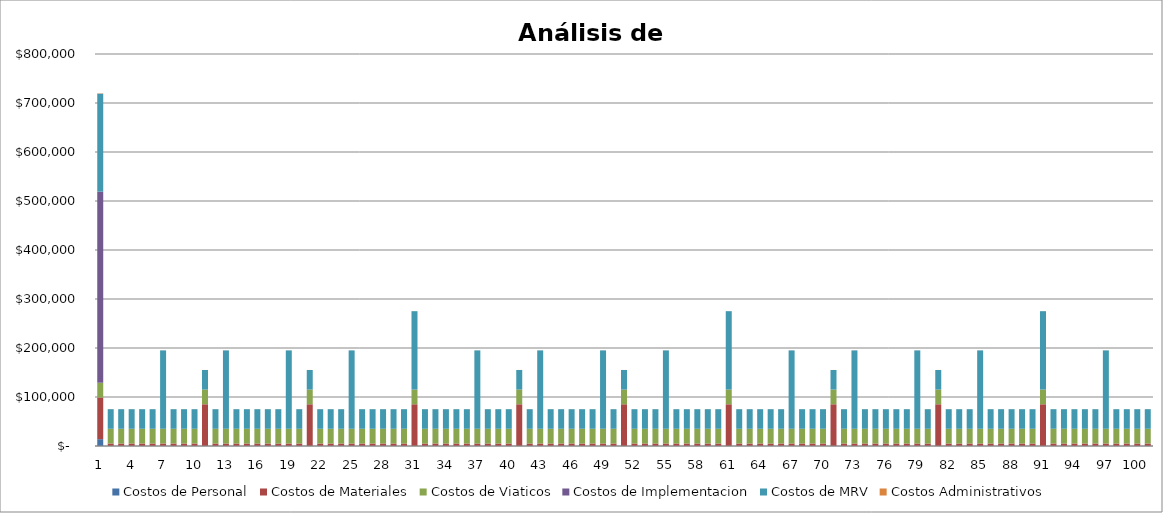
| Category | Costos de Personal | Costos de Materiales | Costos de Viaticos | Costos de Implementacion | Costos de MRV | Costos Administrativos |
|---|---|---|---|---|---|---|
| 0 | 13955.246 | 85000 | 30000 | 390000 | 200000 | 700 |
| 1 | 134.185 | 5000 | 30000 | 0 | 40000 | 80 |
| 2 | 134.185 | 5000 | 30000 | 0 | 40000 | 80 |
| 3 | 134.185 | 5000 | 30000 | 0 | 40000 | 80 |
| 4 | 134.185 | 5000 | 30000 | 0 | 40000 | 80 |
| 5 | 134.185 | 5000 | 30000 | 0 | 40000 | 80 |
| 6 | 134.185 | 5000 | 30000 | 0 | 160000 | 80 |
| 7 | 134.185 | 5000 | 30000 | 0 | 40000 | 80 |
| 8 | 134.185 | 5000 | 30000 | 0 | 40000 | 80 |
| 9 | 134.185 | 5000 | 30000 | 0 | 40000 | 80 |
| 10 | 134.185 | 85000 | 30000 | 0 | 40000 | 80 |
| 11 | 134.185 | 5000 | 30000 | 0 | 40000 | 80 |
| 12 | 134.185 | 5000 | 30000 | 0 | 160000 | 80 |
| 13 | 134.185 | 5000 | 30000 | 0 | 40000 | 80 |
| 14 | 134.185 | 5000 | 30000 | 0 | 40000 | 80 |
| 15 | 134.185 | 5000 | 30000 | 0 | 40000 | 80 |
| 16 | 134.185 | 5000 | 30000 | 0 | 40000 | 80 |
| 17 | 134.185 | 5000 | 30000 | 0 | 40000 | 80 |
| 18 | 134.185 | 5000 | 30000 | 0 | 160000 | 80 |
| 19 | 134.185 | 5000 | 30000 | 0 | 40000 | 80 |
| 20 | 134.185 | 85000 | 30000 | 0 | 40000 | 80 |
| 21 | 134.185 | 5000 | 30000 | 0 | 40000 | 80 |
| 22 | 134.185 | 5000 | 30000 | 0 | 40000 | 80 |
| 23 | 134.185 | 5000 | 30000 | 0 | 40000 | 80 |
| 24 | 134.185 | 5000 | 30000 | 0 | 160000 | 80 |
| 25 | 134.185 | 5000 | 30000 | 0 | 40000 | 80 |
| 26 | 134.185 | 5000 | 30000 | 0 | 40000 | 80 |
| 27 | 134.185 | 5000 | 30000 | 0 | 40000 | 80 |
| 28 | 134.185 | 5000 | 30000 | 0 | 40000 | 80 |
| 29 | 134.185 | 5000 | 30000 | 0 | 40000 | 80 |
| 30 | 134.185 | 85000 | 30000 | 0 | 160000 | 80 |
| 31 | 134.185 | 5000 | 30000 | 0 | 40000 | 80 |
| 32 | 134.185 | 5000 | 30000 | 0 | 40000 | 80 |
| 33 | 134.185 | 5000 | 30000 | 0 | 40000 | 80 |
| 34 | 134.185 | 5000 | 30000 | 0 | 40000 | 80 |
| 35 | 134.185 | 5000 | 30000 | 0 | 40000 | 80 |
| 36 | 134.185 | 5000 | 30000 | 0 | 160000 | 80 |
| 37 | 134.185 | 5000 | 30000 | 0 | 40000 | 80 |
| 38 | 134.185 | 5000 | 30000 | 0 | 40000 | 80 |
| 39 | 134.185 | 5000 | 30000 | 0 | 40000 | 80 |
| 40 | 134.185 | 85000 | 30000 | 0 | 40000 | 80 |
| 41 | 134.185 | 5000 | 30000 | 0 | 40000 | 80 |
| 42 | 134.185 | 5000 | 30000 | 0 | 160000 | 80 |
| 43 | 134.185 | 5000 | 30000 | 0 | 40000 | 80 |
| 44 | 134.185 | 5000 | 30000 | 0 | 40000 | 80 |
| 45 | 134.185 | 5000 | 30000 | 0 | 40000 | 80 |
| 46 | 134.185 | 5000 | 30000 | 0 | 40000 | 80 |
| 47 | 134.185 | 5000 | 30000 | 0 | 40000 | 80 |
| 48 | 134.185 | 5000 | 30000 | 0 | 160000 | 80 |
| 49 | 134.185 | 5000 | 30000 | 0 | 40000 | 80 |
| 50 | 134.185 | 85000 | 30000 | 0 | 40000 | 80 |
| 51 | 134.185 | 5000 | 30000 | 0 | 40000 | 80 |
| 52 | 134.185 | 5000 | 30000 | 0 | 40000 | 80 |
| 53 | 134.185 | 5000 | 30000 | 0 | 40000 | 80 |
| 54 | 134.185 | 5000 | 30000 | 0 | 160000 | 80 |
| 55 | 134.185 | 5000 | 30000 | 0 | 40000 | 80 |
| 56 | 134.185 | 5000 | 30000 | 0 | 40000 | 80 |
| 57 | 134.185 | 5000 | 30000 | 0 | 40000 | 80 |
| 58 | 134.185 | 5000 | 30000 | 0 | 40000 | 80 |
| 59 | 134.185 | 5000 | 30000 | 0 | 40000 | 80 |
| 60 | 134.185 | 85000 | 30000 | 0 | 160000 | 80 |
| 61 | 134.185 | 5000 | 30000 | 0 | 40000 | 80 |
| 62 | 134.185 | 5000 | 30000 | 0 | 40000 | 80 |
| 63 | 134.185 | 5000 | 30000 | 0 | 40000 | 80 |
| 64 | 134.185 | 5000 | 30000 | 0 | 40000 | 80 |
| 65 | 134.185 | 5000 | 30000 | 0 | 40000 | 80 |
| 66 | 134.185 | 5000 | 30000 | 0 | 160000 | 80 |
| 67 | 134.185 | 5000 | 30000 | 0 | 40000 | 80 |
| 68 | 134.185 | 5000 | 30000 | 0 | 40000 | 80 |
| 69 | 134.185 | 5000 | 30000 | 0 | 40000 | 80 |
| 70 | 134.185 | 85000 | 30000 | 0 | 40000 | 80 |
| 71 | 134.185 | 5000 | 30000 | 0 | 40000 | 80 |
| 72 | 134.185 | 5000 | 30000 | 0 | 160000 | 80 |
| 73 | 134.185 | 5000 | 30000 | 0 | 40000 | 80 |
| 74 | 134.185 | 5000 | 30000 | 0 | 40000 | 80 |
| 75 | 134.185 | 5000 | 30000 | 0 | 40000 | 80 |
| 76 | 134.185 | 5000 | 30000 | 0 | 40000 | 80 |
| 77 | 134.185 | 5000 | 30000 | 0 | 40000 | 80 |
| 78 | 134.185 | 5000 | 30000 | 0 | 160000 | 80 |
| 79 | 134.185 | 5000 | 30000 | 0 | 40000 | 80 |
| 80 | 134.185 | 85000 | 30000 | 0 | 40000 | 80 |
| 81 | 134.185 | 5000 | 30000 | 0 | 40000 | 80 |
| 82 | 134.185 | 5000 | 30000 | 0 | 40000 | 80 |
| 83 | 134.185 | 5000 | 30000 | 0 | 40000 | 80 |
| 84 | 134.185 | 5000 | 30000 | 0 | 160000 | 80 |
| 85 | 134.185 | 5000 | 30000 | 0 | 40000 | 80 |
| 86 | 134.185 | 5000 | 30000 | 0 | 40000 | 80 |
| 87 | 134.185 | 5000 | 30000 | 0 | 40000 | 80 |
| 88 | 134.185 | 5000 | 30000 | 0 | 40000 | 80 |
| 89 | 134.185 | 5000 | 30000 | 0 | 40000 | 80 |
| 90 | 134.185 | 85000 | 30000 | 0 | 160000 | 80 |
| 91 | 134.185 | 5000 | 30000 | 0 | 40000 | 80 |
| 92 | 134.185 | 5000 | 30000 | 0 | 40000 | 80 |
| 93 | 134.185 | 5000 | 30000 | 0 | 40000 | 80 |
| 94 | 134.185 | 5000 | 30000 | 0 | 40000 | 80 |
| 95 | 134.185 | 5000 | 30000 | 0 | 40000 | 80 |
| 96 | 134.185 | 5000 | 30000 | 0 | 160000 | 80 |
| 97 | 134.185 | 5000 | 30000 | 0 | 40000 | 80 |
| 98 | 134.185 | 5000 | 30000 | 0 | 40000 | 80 |
| 99 | 134.185 | 5000 | 30000 | 0 | 40000 | 80 |
| 100 | 134.185 | 5000 | 30000 | 0 | 40000 | 80 |